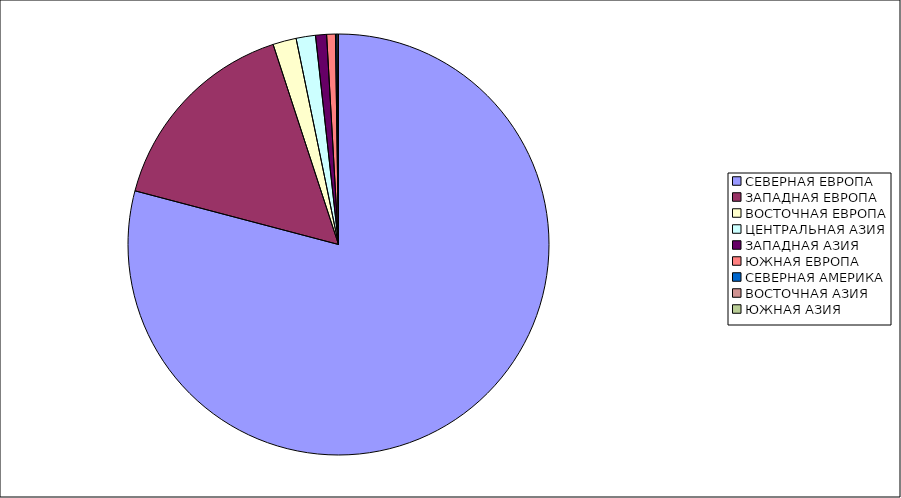
| Category | Оборот |
|---|---|
| СЕВЕРНАЯ ЕВРОПА | 79.104 |
| ЗАПАДНАЯ ЕВРОПА | 15.868 |
| ВОСТОЧНАЯ ЕВРОПА | 1.796 |
| ЦЕНТРАЛЬНАЯ АЗИЯ | 1.487 |
| ЗАПАДНАЯ АЗИЯ | 0.844 |
| ЮЖНАЯ ЕВРОПА | 0.67 |
| СЕВЕРНАЯ АМЕРИКА | 0.117 |
| ВОСТОЧНАЯ АЗИЯ | 0.113 |
| ЮЖНАЯ АЗИЯ | 0 |